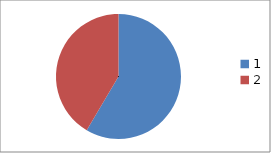
| Category | Series 0 |
|---|---|
| 0 | 93 |
| 1 | 66 |